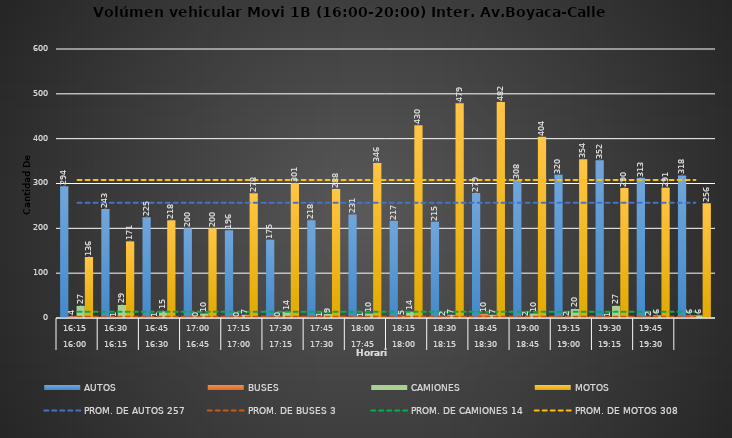
| Category | AUTOS | BUSES | CAMIONES | MOTOS |
|---|---|---|---|---|
| 0 | 294 | 4 | 27 | 136 |
| 1 | 243 | 1 | 29 | 171 |
| 2 | 225 | 1 | 15 | 218 |
| 3 | 200 | 0 | 10 | 200 |
| 4 | 196 | 0 | 7 | 278 |
| 5 | 175 | 0 | 14 | 301 |
| 6 | 218 | 1 | 9 | 288 |
| 7 | 231 | 1 | 10 | 346 |
| 8 | 217 | 5 | 14 | 430 |
| 9 | 215 | 2 | 7 | 479 |
| 10 | 279 | 10 | 7 | 482 |
| 11 | 308 | 2 | 10 | 404 |
| 12 | 320 | 2 | 20 | 354 |
| 13 | 352 | 1 | 27 | 290 |
| 14 | 313 | 2 | 6 | 291 |
| 15 | 318 | 6 | 6 | 256 |